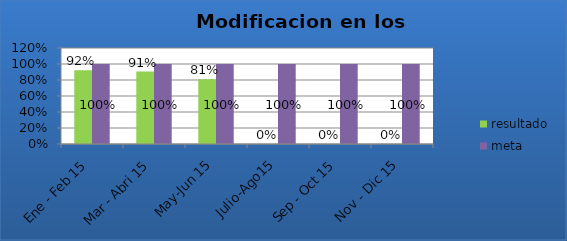
| Category | resultado | meta |
|---|---|---|
| Ene - Feb 15 | 0.922 | 1 |
| Mar - Abri 15 | 0.906 | 1 |
| May-Jun 15 | 0.81 | 1 |
| Julio-Ago15 | 0 | 1 |
| Sep - Oct 15 | 0 | 1 |
| Nov - Dic 15 | 0 | 1 |